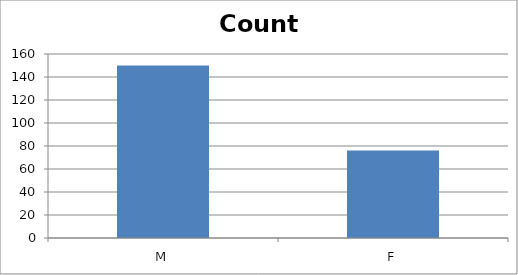
| Category | Count |
|---|---|
| M | 150 |
| F | 76 |